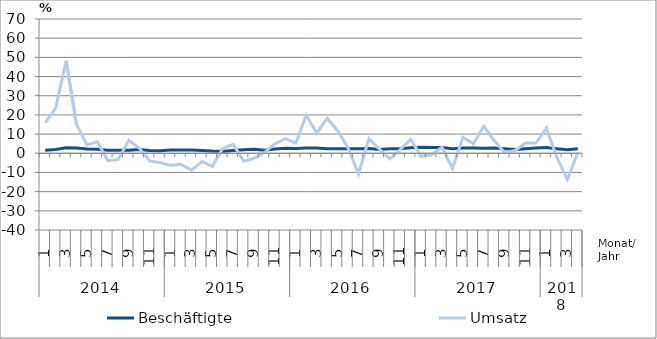
| Category | Beschäftigte | Umsatz |
|---|---|---|
| 0 | 1.6 | 15.9 |
| 1 | 2 | 23.5 |
| 2 | 2.9 | 48.2 |
| 3 | 2.8 | 14.9 |
| 4 | 2.2 | 4.5 |
| 5 | 2.1 | 6 |
| 6 | 1.6 | -3.9 |
| 7 | 1.6 | -3.2 |
| 8 | 1.6 | 6.8 |
| 9 | 2 | 2.7 |
| 10 | 1.4 | -3.9 |
| 11 | 1.3 | -4.9 |
| 12 | 1.7 | -6.3 |
| 13 | 1.7 | -5.7 |
| 14 | 1.7 | -8.8 |
| 15 | 1.5 | -4.4 |
| 16 | 1.2 | -6.8 |
| 17 | 1.1 | 2.5 |
| 18 | 1.5 | 4.7 |
| 19 | 1.8 | -4.1 |
| 20 | 2.1 | -2.6 |
| 21 | 1.6 | 0.5 |
| 22 | 2.2 | 4.9 |
| 23 | 2.6 | 7.6 |
| 24 | 2.5 | 5.3 |
| 25 | 2.7 | 19.9 |
| 26 | 2.8 | 10.5 |
| 27 | 2.4 | 18.3 |
| 28 | 2.4 | 11.9 |
| 29 | 2.4 | 2.8 |
| 30 | 2.3 | -10.7 |
| 31 | 2.5 | 7.5 |
| 32 | 2 | 2.2 |
| 33 | 2.4 | -2.9 |
| 34 | 2.3 | 1.9 |
| 35 | 2.9 | 7.2 |
| 36 | 3.1 | -1.6 |
| 37 | 3 | -0.8 |
| 38 | 3 | 3.1 |
| 39 | 2.4 | -7.9 |
| 40 | 2.8 | 8.3 |
| 41 | 2.7 | 4.9 |
| 42 | 2.6 | 14.1 |
| 43 | 2.7 | 6.5 |
| 44 | 2.3 | 0.4 |
| 45 | 2 | 1.4 |
| 46 | 2.4 | 5.3 |
| 47 | 2.8 | 5.3 |
| 48 | 3 | 13.2 |
| 49 | 2.4 | -2.2 |
| 50 | 1.8 | -13.7 |
| 51 | 2.4 | 0.4 |